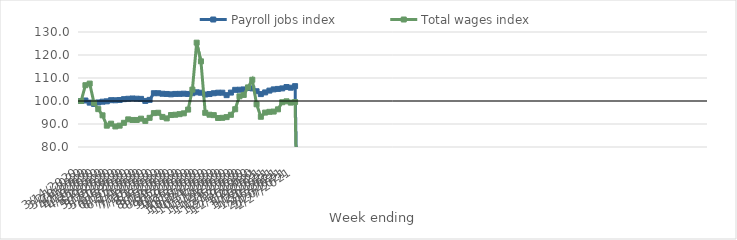
| Category | Payroll jobs index | Total wages index |
|---|---|---|
| 14/03/2020 | 100 | 100 |
| 21/03/2020 | 100.212 | 106.871 |
| 28/03/2020 | 99.291 | 107.568 |
| 04/04/2020 | 98.737 | 99.214 |
| 11/04/2020 | 99.367 | 96.456 |
| 18/04/2020 | 99.697 | 93.771 |
| 25/04/2020 | 99.864 | 89.274 |
| 02/05/2020 | 100.354 | 90.144 |
| 09/05/2020 | 100.314 | 88.938 |
| 16/05/2020 | 100.436 | 89.286 |
| 23/05/2020 | 100.797 | 90.514 |
| 30/05/2020 | 100.971 | 92.016 |
| 06/06/2020 | 101.09 | 91.755 |
| 13/06/2020 | 100.994 | 91.757 |
| 20/06/2020 | 100.928 | 92.321 |
| 27/06/2020 | 100.031 | 91.338 |
| 04/07/2020 | 100.488 | 92.678 |
| 11/07/2020 | 103.385 | 94.734 |
| 18/07/2020 | 103.381 | 94.889 |
| 25/07/2020 | 103.158 | 93.084 |
| 01/08/2020 | 103.059 | 92.433 |
| 08/08/2020 | 102.9 | 93.903 |
| 15/08/2020 | 103.075 | 94.024 |
| 22/08/2020 | 103.104 | 94.279 |
| 29/08/2020 | 103.185 | 94.636 |
| 05/09/2020 | 103.062 | 96.266 |
| 12/09/2020 | 103.389 | 104.958 |
| 19/09/2020 | 103.78 | 125.366 |
| 26/09/2020 | 103.597 | 117.245 |
| 03/10/2020 | 102.821 | 94.868 |
| 10/10/2020 | 103.026 | 94.035 |
| 17/10/2020 | 103.373 | 93.858 |
| 24/10/2020 | 103.609 | 92.608 |
| 31/10/2020 | 103.609 | 92.688 |
| 07/11/2020 | 102.541 | 92.995 |
| 14/11/2020 | 103.657 | 93.992 |
| 21/11/2020 | 104.851 | 96.424 |
| 28/11/2020 | 104.894 | 102.037 |
| 05/12/2020 | 105.032 | 102.642 |
| 12/12/2020 | 105.648 | 105.911 |
| 19/12/2020 | 105.484 | 109.231 |
| 26/12/2020 | 104.241 | 98.572 |
| 02/01/2021 | 103.002 | 93.148 |
| 09/01/2021 | 103.736 | 94.963 |
| 16/01/2021 | 104.522 | 95.289 |
| 23/01/2021 | 105.051 | 95.404 |
| 30/01/2021 | 105.252 | 96.375 |
| 06/02/2021 | 105.481 | 99.46 |
| 13/02/2021 | 106.072 | 99.859 |
| 20/02/2021 | 105.788 | 99.296 |
| 27/02/2021 | 106.457 | 99.567 |